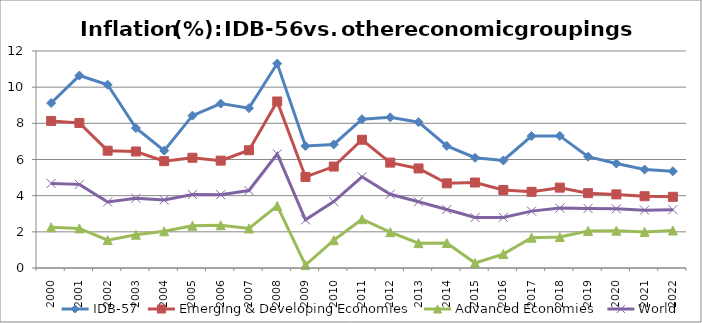
| Category | IDB-57 | Emerging & Developing Economies | Advanced Economies | World |
|---|---|---|---|---|
| 2000.0 | 9.123 | 8.134 | 2.25 | 4.677 |
| 2001.0 | 10.642 | 8.02 | 2.188 | 4.625 |
| 2002.0 | 10.136 | 6.487 | 1.542 | 3.651 |
| 2003.0 | 7.74 | 6.442 | 1.84 | 3.854 |
| 2004.0 | 6.489 | 5.91 | 2.027 | 3.767 |
| 2005.0 | 8.425 | 6.096 | 2.336 | 4.067 |
| 2006.0 | 9.091 | 5.937 | 2.364 | 4.052 |
| 2007.0 | 8.84 | 6.511 | 2.186 | 4.286 |
| 2008.0 | 11.305 | 9.209 | 3.434 | 6.306 |
| 2009.0 | 6.747 | 5.035 | 0.162 | 2.663 |
| 2010.0 | 6.832 | 5.609 | 1.536 | 3.673 |
| 2011.0 | 8.228 | 7.093 | 2.697 | 5.045 |
| 2012.0 | 8.332 | 5.827 | 1.983 | 4.078 |
| 2013.0 | 8.064 | 5.505 | 1.373 | 3.662 |
| 2014.0 | 6.75 | 4.682 | 1.381 | 3.233 |
| 2015.0 | 6.097 | 4.727 | 0.274 | 2.789 |
| 2016.0 | 5.945 | 4.315 | 0.771 | 2.799 |
| 2017.0 | 7.293 | 4.212 | 1.676 | 3.145 |
| 2018.0 | 7.306 | 4.443 | 1.711 | 3.312 |
| 2019.0 | 6.155 | 4.139 | 2.05 | 3.291 |
| 2020.0 | 5.778 | 4.071 | 2.064 | 3.272 |
| 2021.0 | 5.442 | 3.969 | 1.995 | 3.199 |
| 2022.0 | 5.351 | 3.937 | 2.075 | 3.226 |